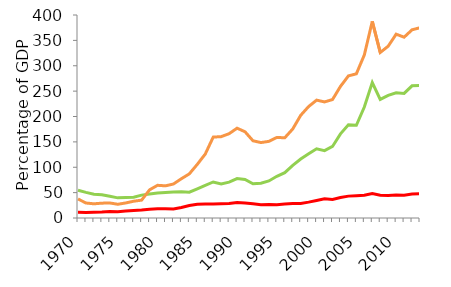
| Category | Latin America | Advanced Economies | Emerging Asia |
|---|---|---|---|
| 1970.0 | 11.174 | 54.787 | 37.48 |
| 1971.0 | 10.649 | 50.524 | 29.55 |
| 1972.0 | 11.442 | 46.677 | 27.967 |
| 1973.0 | 11.936 | 45.887 | 29.24 |
| 1974.0 | 12.823 | 42.746 | 29.595 |
| 1975.0 | 12.488 | 39.689 | 27.065 |
| 1976.0 | 13.687 | 40.469 | 29.632 |
| 1977.0 | 14.813 | 41.037 | 33.061 |
| 1978.0 | 15.609 | 45.088 | 35.203 |
| 1979.0 | 17.198 | 47.243 | 55.503 |
| 1980.0 | 18.2 | 49.261 | 64.414 |
| 1981.0 | 18.437 | 50.041 | 63.388 |
| 1982.0 | 17.906 | 51.036 | 66.963 |
| 1983.0 | 20.85 | 51.63 | 77.391 |
| 1984.0 | 24.513 | 50.821 | 87.012 |
| 1985.0 | 27.151 | 57.585 | 105.761 |
| 1986.0 | 27.481 | 64.477 | 125.98 |
| 1987.0 | 27.501 | 70.986 | 159.408 |
| 1988.0 | 28.075 | 67.192 | 160.322 |
| 1989.0 | 28.45 | 70.607 | 166.126 |
| 1990.0 | 30.724 | 77.574 | 176.975 |
| 1991.0 | 29.586 | 75.867 | 169.92 |
| 1992.0 | 27.854 | 67.514 | 152.2 |
| 1993.0 | 26.174 | 68.529 | 148.623 |
| 1994.0 | 26.707 | 72.946 | 151.054 |
| 1995.0 | 26.079 | 82.126 | 158.701 |
| 1996.0 | 27.555 | 89.345 | 158.113 |
| 1997.0 | 28.712 | 103.65 | 175.432 |
| 1998.0 | 28.786 | 116.285 | 202.313 |
| 1999.0 | 31.306 | 126.566 | 219.712 |
| 2000.0 | 34.595 | 136.403 | 232.25 |
| 2001.0 | 37.902 | 132.832 | 228.729 |
| 2002.0 | 36.476 | 140.978 | 233.39 |
| 2003.0 | 40.347 | 165.798 | 259.289 |
| 2004.0 | 43.108 | 183.652 | 280.016 |
| 2005.0 | 43.93 | 182.735 | 284.126 |
| 2006.0 | 44.821 | 218.769 | 321.304 |
| 2007.0 | 48.356 | 266.83 | 387.429 |
| 2008.0 | 44.681 | 233.664 | 326.143 |
| 2009.0 | 44.526 | 241.775 | 338.489 |
| 2010.0 | 45.268 | 246.671 | 362.235 |
| 2011.0 | 44.9 | 245.569 | 356.278 |
| 2012.0 | 47.266 | 260.496 | 370.804 |
| 2013.0 | 47.753 | 261.064 | 374.938 |